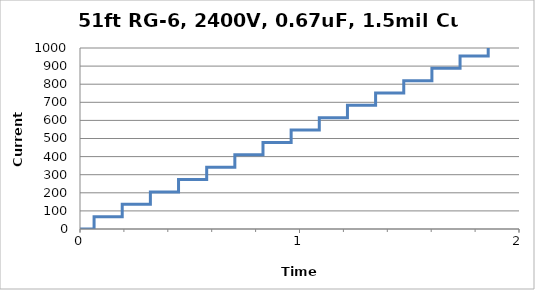
| Category | Series 0 |
|---|---|
| 0.0 | 0 |
| 0.06412831745804658 | 0 |
| 0.06412831745804658 | 68.306 |
| 0.19238495237413972 | 68.306 |
| 0.19238495237413972 | 136.612 |
| 0.32064158729023284 | 136.612 |
| 0.32064158729023284 | 204.918 |
| 0.44889822220632597 | 204.918 |
| 0.44889822220632597 | 273.225 |
| 0.5771548571224191 | 273.225 |
| 0.5771548571224191 | 341.531 |
| 0.7054114920385123 | 341.531 |
| 0.7054114920385123 | 409.837 |
| 0.8336681269546055 | 409.837 |
| 0.8336681269546055 | 478.143 |
| 0.9619247618706986 | 478.143 |
| 0.9619247618706986 | 546.449 |
| 1.0901813967867917 | 546.449 |
| 1.0901813967867917 | 614.755 |
| 1.218438031702885 | 614.755 |
| 1.218438031702885 | 683.062 |
| 1.346694666618978 | 683.062 |
| 1.346694666618978 | 751.368 |
| 1.4749513015350713 | 751.368 |
| 1.4749513015350713 | 819.674 |
| 1.6032079364511644 | 819.674 |
| 1.6032079364511644 | 887.98 |
| 1.7314645713672576 | 887.98 |
| 1.7314645713672576 | 956.286 |
| 1.8597212062833508 | 956.286 |
| 1.8597212062833508 | 1024.592 |
| 1.987977841199444 | 1024.592 |
| 1.987977841199444 | 1092.898 |
| 2.116234476115537 | 1092.898 |
| 2.116234476115537 | 1161.205 |
| 2.24449111103163 | 1161.205 |
| 2.24449111103163 | 1229.511 |
| 2.372747745947723 | 1229.511 |
| 2.372747745947723 | 1297.817 |
| 2.5010043808638156 | 1297.817 |
| 2.5010043808638156 | 1366.123 |
| 2.6292610157799086 | 1366.123 |
| 2.6292610157799086 | 1434.429 |
| 2.7575176506960015 | 1434.429 |
| 2.7575176506960015 | 1502.735 |
| 2.8857742856120945 | 1502.735 |
| 2.8857742856120945 | 1571.041 |
| 3.0140309205281874 | 1571.041 |
| 3.0140309205281874 | 1639.348 |
| 3.1422875554442804 | 1639.348 |
| 3.1422875554442804 | 1707.654 |
| 3.2705441903603734 | 1707.654 |
| 3.2705441903603734 | 1775.96 |
| 3.3988008252764663 | 1775.96 |
| 3.3988008252764663 | 1844.266 |
| 3.5270574601925593 | 1844.266 |
| 3.5270574601925593 | 1912.572 |
| 3.6553140951086522 | 1912.572 |
| 3.6553140951086522 | 1980.878 |
| 3.783570730024745 | 1980.878 |
| 3.783570730024745 | 2049.184 |
| 3.9118273649408386 | 2049.184 |
| 3.9118273649408386 | 2117.49 |
| 4.0400839998569325 | 2117.49 |
| 4.0400839998569325 | 2185.797 |
| 4.168340634773026 | 2185.797 |
| 4.168340634773026 | 2254.103 |
| 4.296597269689119 | 2254.103 |
| 4.296597269689119 | 2322.409 |
| 4.424853904605213 | 2322.409 |
| 4.424853904605213 | 2390.715 |